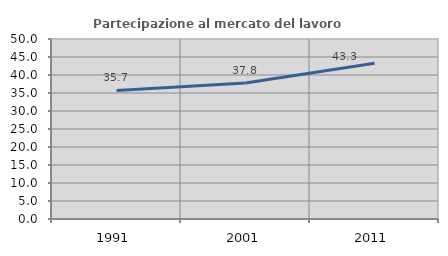
| Category | Partecipazione al mercato del lavoro  femminile |
|---|---|
| 1991.0 | 35.701 |
| 2001.0 | 37.77 |
| 2011.0 | 43.269 |